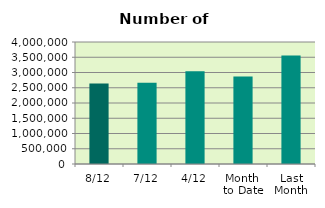
| Category | Series 0 |
|---|---|
| 8/12 | 2641620 |
| 7/12 | 2662650 |
| 4/12 | 3037348 |
| Month 
to Date | 2868960.333 |
| Last
Month | 3558191.714 |